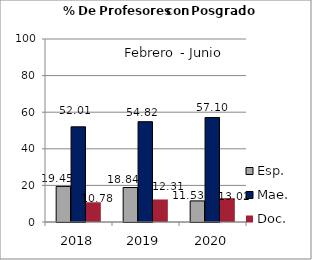
| Category | Esp. | Mae. | Doc. |
|---|---|---|---|
| 2018.0 | 19.45 | 52.01 | 10.78 |
| 2019.0 | 18.84 | 54.82 | 12.31 |
| 2020.0 | 11.53 | 57.1 | 13.02 |